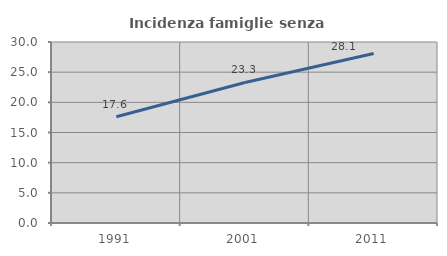
| Category | Incidenza famiglie senza nuclei |
|---|---|
| 1991.0 | 17.604 |
| 2001.0 | 23.292 |
| 2011.0 | 28.098 |